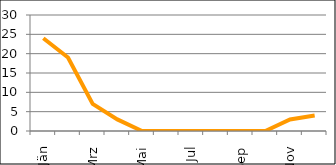
| Category | Series 0 |
|---|---|
| Jän | 24 |
| Feb | 19 |
| Mrz | 7 |
| Apr | 3 |
| Mai | 0 |
| Jun | 0 |
| Jul | 0 |
| Aug | 0 |
| Sep | 0 |
| Okt | 0 |
| Nov | 3 |
| Dez | 4 |